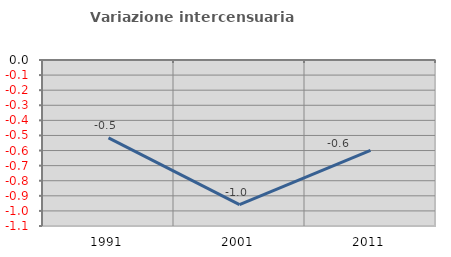
| Category | Variazione intercensuaria annua |
|---|---|
| 1991.0 | -0.516 |
| 2001.0 | -0.959 |
| 2011.0 | -0.598 |